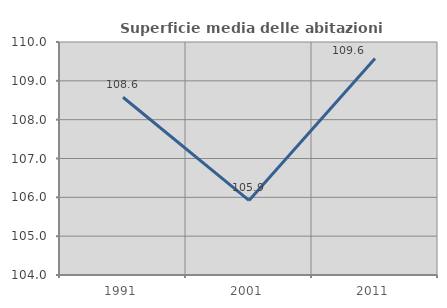
| Category | Superficie media delle abitazioni occupate |
|---|---|
| 1991.0 | 108.576 |
| 2001.0 | 105.921 |
| 2011.0 | 109.573 |